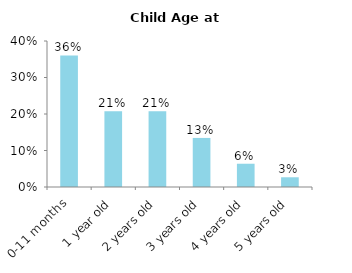
| Category | Series 0 |
|---|---|
| 0-11 months | 0.36 |
| 1 year old | 0.207 |
| 2 years old | 0.207 |
| 3 years old | 0.134 |
| 4 years old | 0.064 |
| 5 years old | 0.027 |